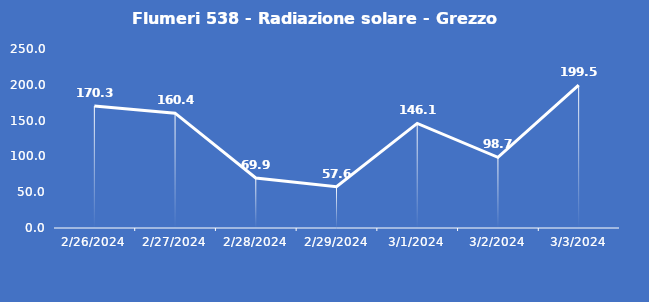
| Category | Flumeri 538 - Radiazione solare - Grezzo (W/m2) |
|---|---|
| 2/26/24 | 170.3 |
| 2/27/24 | 160.4 |
| 2/28/24 | 69.9 |
| 2/29/24 | 57.6 |
| 3/1/24 | 146.1 |
| 3/2/24 | 98.7 |
| 3/3/24 | 199.5 |